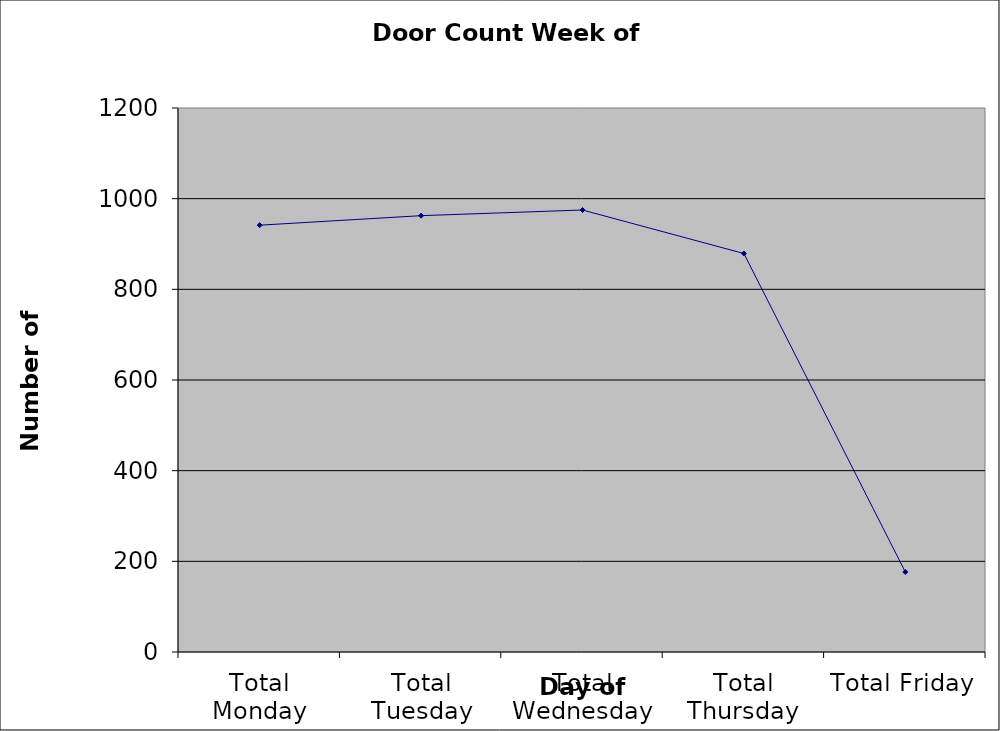
| Category | Series 0 |
|---|---|
| Total Monday | 941.5 |
| Total Tuesday | 962.5 |
| Total Wednesday | 975 |
| Total Thursday | 879 |
| Total Friday | 176.5 |